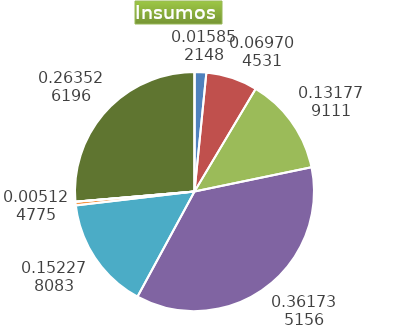
| Category | Series 0 |
|---|---|
| Control arvenses | 242216 |
| Control fitosanitario | 1065064 |
| Cosecha y beneficio | 2013544.669 |
| Fertilización | 5527203 |
| Instalación | 2326762.728 |
| Otros | 78305 |
| Podas | 0 |
| Riego | 0 |
| Transporte | 4026600 |
| Tutorado | 0 |